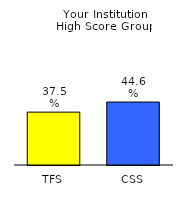
| Category | Series 0 |
|---|---|
| TFS | 0.375 |
| CSS | 0.446 |